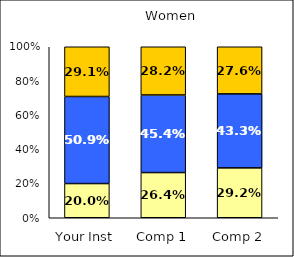
| Category | Low Civic Minded Values | Average Civic Minded Values | High Civic Minded Values |
|---|---|---|---|
| Your Inst | 0.2 | 0.509 | 0.291 |
| Comp 1 | 0.264 | 0.454 | 0.282 |
| Comp 2 | 0.292 | 0.433 | 0.276 |